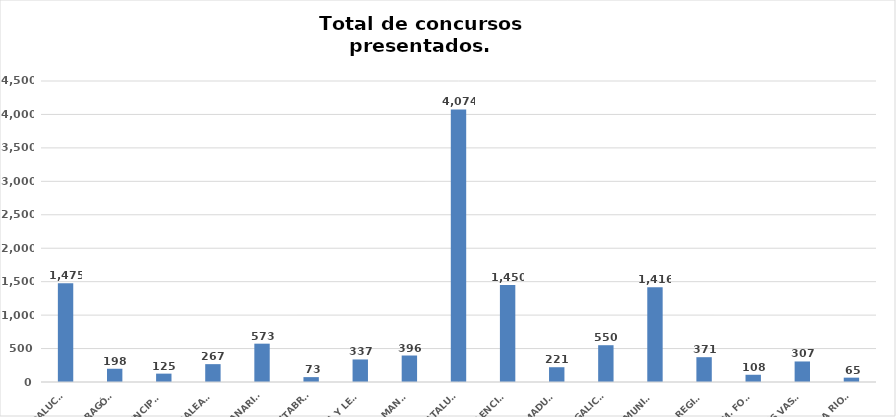
| Category | Series 0 |
|---|---|
| ANDALUCÍA | 1475 |
| ARAGÓN | 198 |
| ASTURIAS, PRINCIPADO | 125 |
| ILLES BALEARS | 267 |
| CANARIAS | 573 |
| CANTABRIA | 73 |
| CASTILLA Y LEÓN | 337 |
| CASTILLA - LA MANCHA | 396 |
| CATALUÑA | 4074 |
| COMUNITAT VALENCIANA | 1450 |
| EXTREMADURA | 221 |
| GALICIA | 550 |
| MADRID, COMUNIDAD | 1416 |
| MURCIA, REGIÓN | 371 |
| NAVARRA, COM. FORAL | 108 |
| PAÍS VASCO | 307 |
| LA RIOJA | 65 |